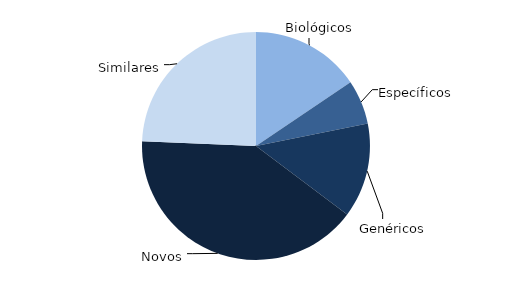
| Category | Series 0 |
|---|---|
| Biológicos | 8380352806.38 |
| Específicos | 3391225168.58 |
| Genéricos | 7237467703.96 |
| Novos | 21795658352.44 |
| Similares | 13124283629.77 |